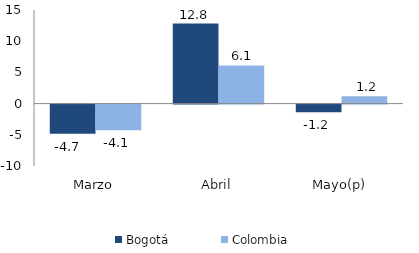
| Category | Bogotá | Colombia |
|---|---|---|
| Marzo | -4.682 | -4.105 |
| Abril | 12.817 | 6.106 |
| Mayo(p) | -1.224 | 1.183 |